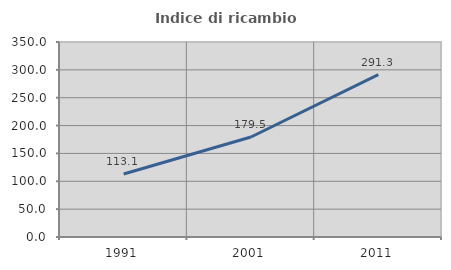
| Category | Indice di ricambio occupazionale  |
|---|---|
| 1991.0 | 113.125 |
| 2001.0 | 179.508 |
| 2011.0 | 291.27 |